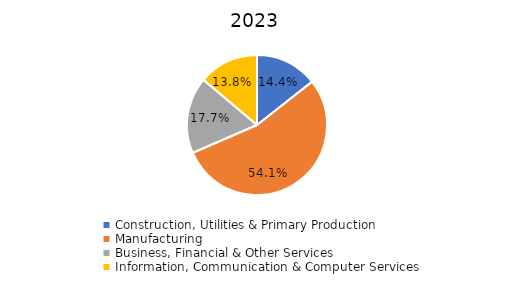
| Category | Series 0 |
|---|---|
| Construction, Utilities & Primary Production  | 0.144 |
| Manufacturing  | 0.541 |
| Business, Financial & Other Services | 0.177 |
| Information, Communication & Computer Services | 0.138 |